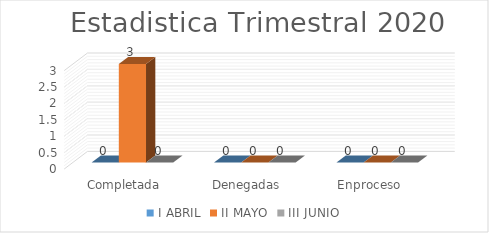
| Category | I ABRIL | II MAYO | III JUNIO |
|---|---|---|---|
| Completada | 0 | 3 | 0 |
| Denegadas | 0 | 0 | 0 |
| Enproceso | 0 | 0 | 0 |